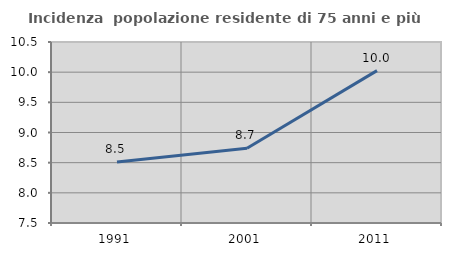
| Category | Incidenza  popolazione residente di 75 anni e più |
|---|---|
| 1991.0 | 8.512 |
| 2001.0 | 8.738 |
| 2011.0 | 10.026 |